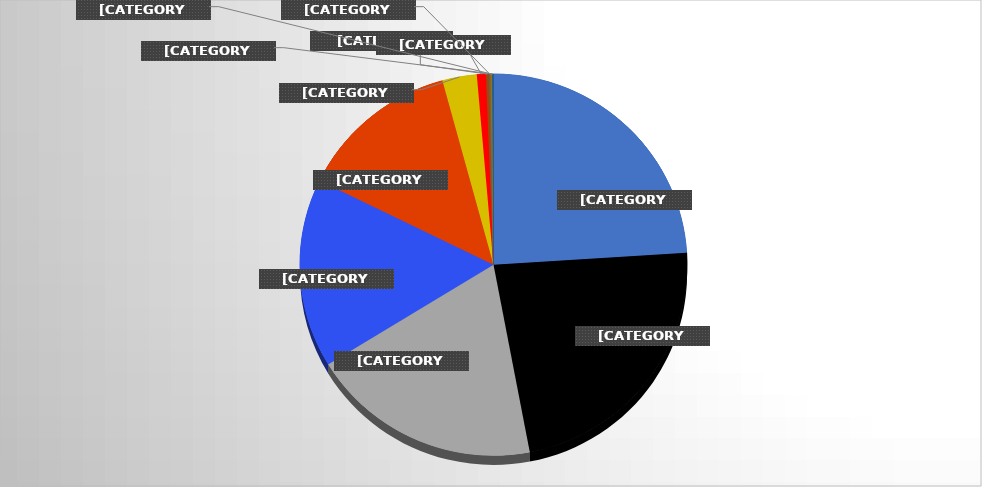
| Category | Series 0 |
|---|---|
| SEC 96% | 96 |
| Big 10 92% | 92 |
| ACC 77% | 77 |
| Pac-12 64% | 64 |
| Big 12 54% | 54 |
| Independent 11.5% | 11.5 |
| AAC 3% | 3 |
| MWC 1% | 1 |
| MAC 0.5% | 0.5 |
| Sun Belt 0.5% | 0.5 |
| C-USA 0.5% | 0.5 |